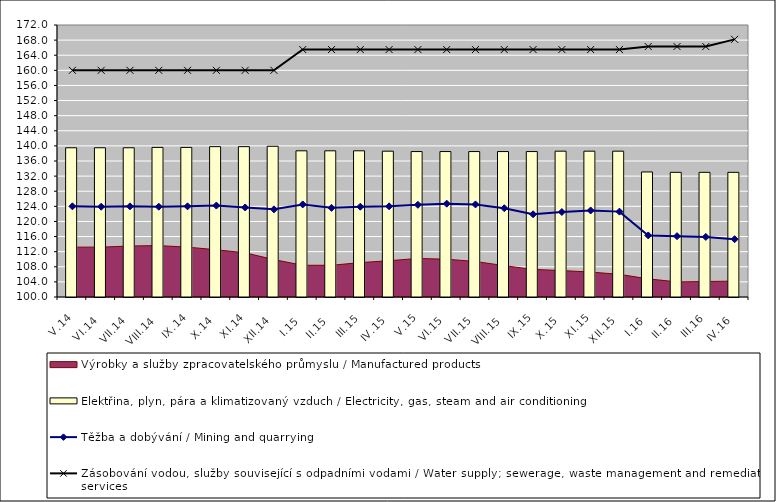
| Category | Elektřina, plyn, pára a klimatizovaný vzduch / Electricity, gas, steam and air conditioning |
|---|---|
| V.14 | 139.5 |
| VI.14 | 139.5 |
| VII.14 | 139.5 |
| VIII.14 | 139.6 |
| IX.14 | 139.6 |
| X.14 | 139.8 |
| XI.14 | 139.8 |
| XII.14 | 139.9 |
| I.15 | 138.7 |
| II.15 | 138.7 |
| III.15 | 138.7 |
| IV.15 | 138.6 |
| V.15 | 138.5 |
| VI.15 | 138.5 |
| VII.15 | 138.5 |
| VIII.15 | 138.5 |
| IX.15 | 138.5 |
| X.15 | 138.6 |
| XI.15 | 138.6 |
| XII.15 | 138.6 |
| I.16 | 133.1 |
| II.16 | 133 |
| III.16 | 133 |
| IV.16 | 133 |